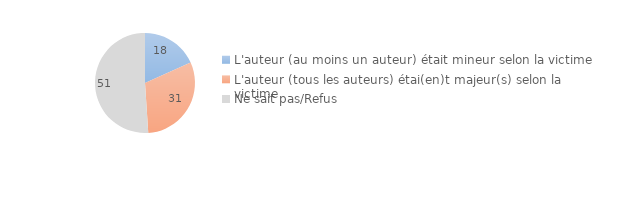
| Category | Series 0 |
|---|---|
| L'auteur (au moins un auteur) était mineur selon la victime | 18.299 |
| L'auteur (tous les auteurs) étai(en)t majeur(s) selon la victime | 30.659 |
| Ne sait pas/Refus | 51.042 |